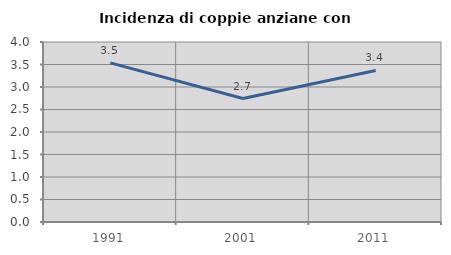
| Category | Incidenza di coppie anziane con figli |
|---|---|
| 1991.0 | 3.535 |
| 2001.0 | 2.743 |
| 2011.0 | 3.368 |